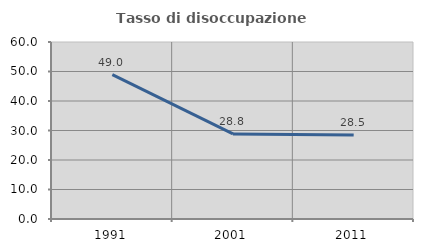
| Category | Tasso di disoccupazione giovanile  |
|---|---|
| 1991.0 | 48.962 |
| 2001.0 | 28.825 |
| 2011.0 | 28.513 |